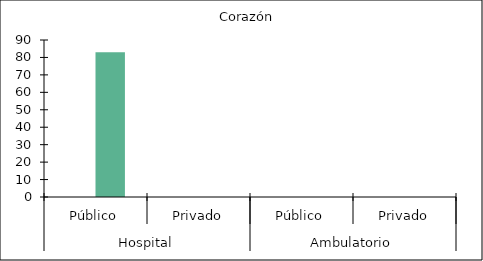
| Category |   |    Corazón |
|---|---|---|
| 0 | 0 | 83 |
| 1 | 0 | 0 |
| 2 | 0 | 0 |
| 3 | 0 | 0 |